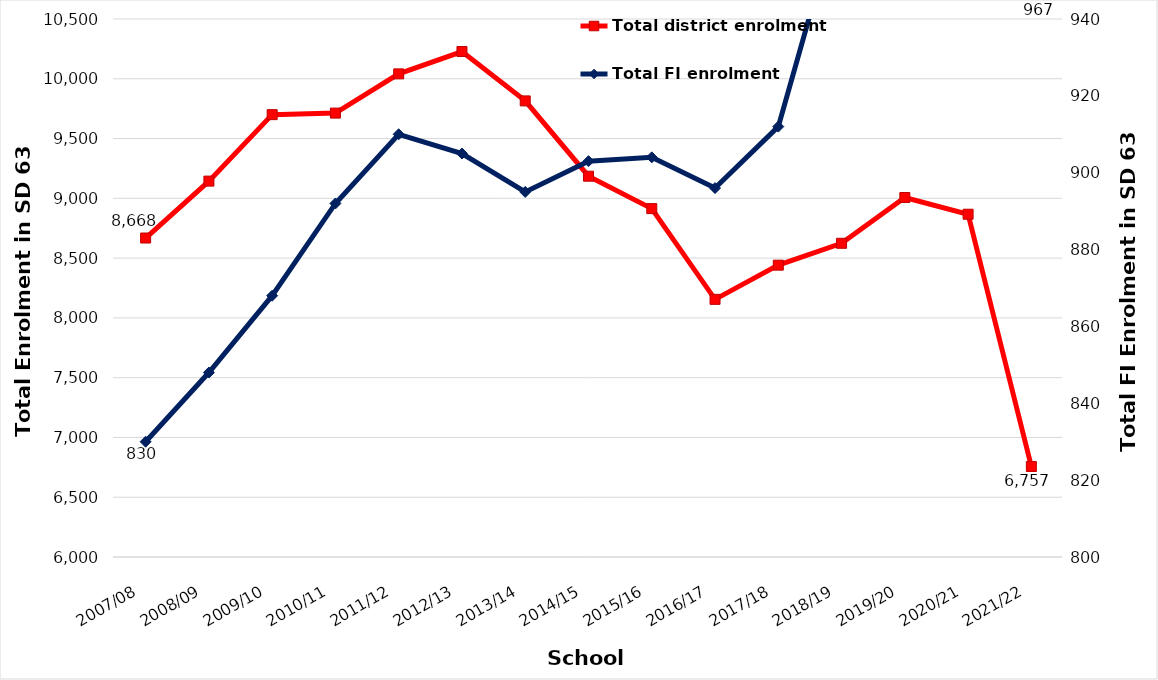
| Category | Total district enrolment  |
|---|---|
| 2007/08 | 8668 |
| 2008/09 | 9144 |
| 2009/10 | 9700 |
| 2010/11 | 9713 |
| 2011/12 | 10041 |
| 2012/13 | 10228 |
| 2013/14 | 9815 |
| 2014/15 | 9185 |
| 2015/16 | 8914 |
| 2016/17 | 8155 |
| 2017/18 | 8441 |
| 2018/19 | 8624 |
| 2019/20 | 9007 |
| 2020/21 | 8867 |
| 2021/22 | 6757 |